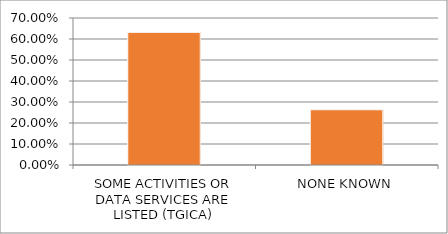
| Category | Series 0 |
|---|---|
| SOME ACTIVITIES OR DATA SERVICES ARE LISTED (TGICA) | 0.632 |
| NONE KNOWN | 0.263 |